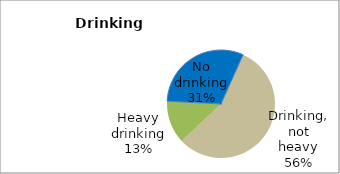
| Category | Series 0 |
|---|---|
| No drinking | 30.89 |
| Drinking, not heavy | 56.263 |
| Heavy drinking | 12.848 |